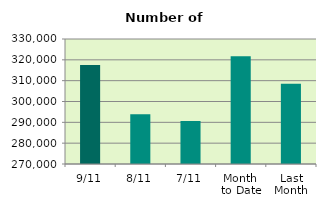
| Category | Series 0 |
|---|---|
| 9/11 | 317574 |
| 8/11 | 293892 |
| 7/11 | 290636 |
| Month 
to Date | 321748.571 |
| Last
Month | 308508.19 |